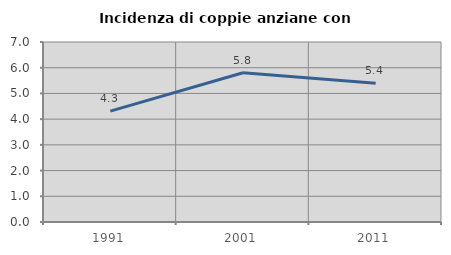
| Category | Incidenza di coppie anziane con figli |
|---|---|
| 1991.0 | 4.313 |
| 2001.0 | 5.805 |
| 2011.0 | 5.396 |